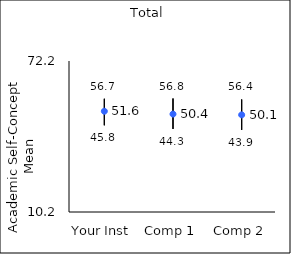
| Category | 25th percentile | 75th percentile | Mean |
|---|---|---|---|
| Your Inst | 45.8 | 56.7 | 51.57 |
| Comp 1 | 44.3 | 56.8 | 50.41 |
| Comp 2 | 43.9 | 56.4 | 50.09 |